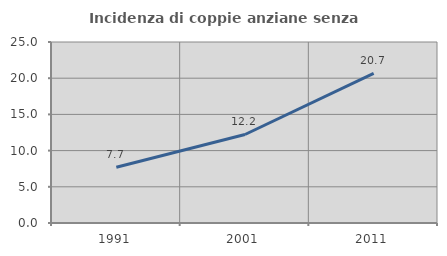
| Category | Incidenza di coppie anziane senza figli  |
|---|---|
| 1991.0 | 7.692 |
| 2001.0 | 12.224 |
| 2011.0 | 20.656 |